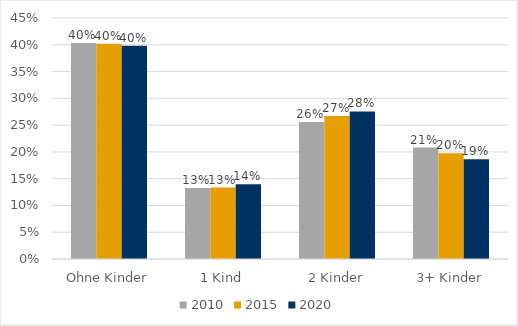
| Category | 2010 | 2015 | 2020 |
|---|---|---|---|
| Ohne Kinder | 0.403 | 0.402 | 0.398 |
| 1 Kind | 0.133 | 0.133 | 0.14 |
| 2 Kinder | 0.256 | 0.267 | 0.275 |
| 3+ Kinder | 0.208 | 0.198 | 0.186 |